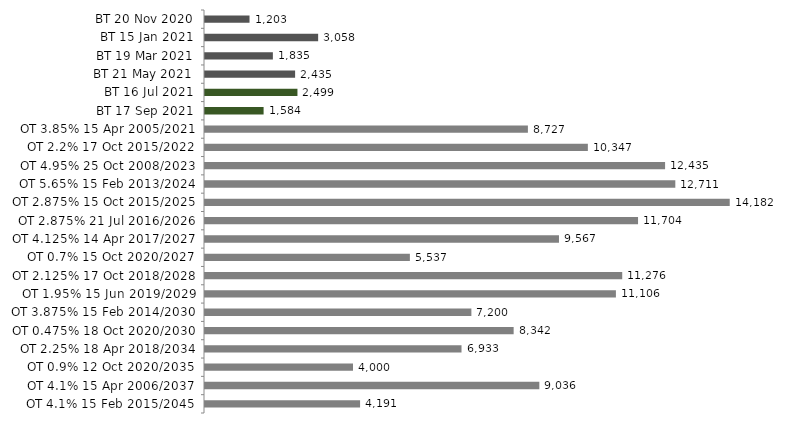
| Category | Series 0 |
|---|---|
| BT 20 Nov 2020 | 1203.173 |
| BT 15 Jan 2021 | 3057.867 |
| BT 19 Mar 2021 | 1834.5 |
| BT 21 May 2021 | 2435.353 |
| BT 16 Jul 2021 | 2498.642 |
| BT 17 Sep 2021 | 1583.759 |
| OT 3.85% 15 Apr 2005/2021 | 8726.958 |
| OT 2.2% 17 Oct 2015/2022 | 10347.462 |
| OT 4.95% 25 Oct 2008/2023 | 12434.734 |
| OT 5.65% 15 Feb 2013/2024 | 12711.355 |
| OT 2.875% 15 Oct 2015/2025 | 14181.75 |
| OT 2.875% 21 Jul 2016/2026 | 11703.946 |
| OT 4.125% 14 Apr 2017/2027 | 9566.841 |
| OT 0.7% 15 Oct 2020/2027 | 5537.428 |
| OT 2.125% 17 Oct 2018/2028 | 11276.387 |
| OT 1.95% 15 Jun 2019/2029 | 11105.52 |
| OT 3.875% 15 Feb 2014/2030 | 7199.513 |
| OT 0.475% 18 Oct 2020/2030 | 8341.933 |
| OT 2.25% 18 Apr 2018/2034 | 6932.895 |
| OT 0.9% 12 Oct 2020/2035 | 4000 |
| OT 4.1% 15 Apr 2006/2037 | 9036.174 |
| OT 4.1% 15 Feb 2015/2045 | 4191.316 |